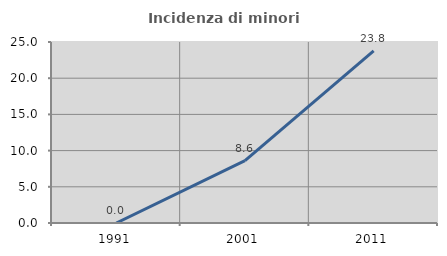
| Category | Incidenza di minori stranieri |
|---|---|
| 1991.0 | 0 |
| 2001.0 | 8.621 |
| 2011.0 | 23.762 |